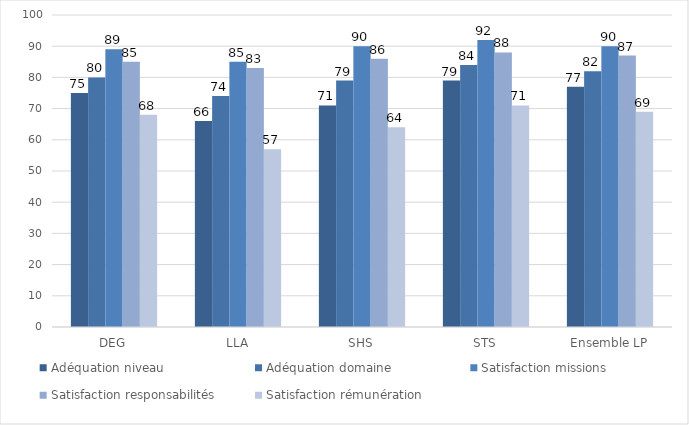
| Category | Adéquation niveau | Adéquation domaine | Satisfaction missions | Satisfaction responsabilités | Satisfaction rémunération |
|---|---|---|---|---|---|
| DEG | 75 | 80 | 89 | 85 | 68 |
| LLA | 66 | 74 | 85 | 83 | 57 |
| SHS | 71 | 79 | 90 | 86 | 64 |
| STS | 79 | 84 | 92 | 88 | 71 |
| Ensemble LP | 77 | 82 | 90 | 87 | 69 |